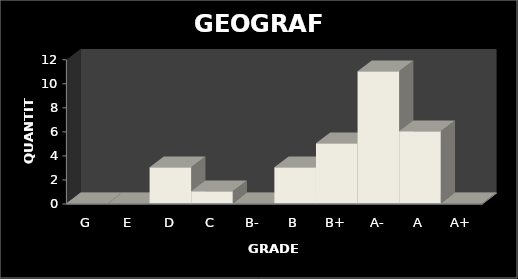
| Category | QUANTITY |
|---|---|
| G | 0 |
| E | 0 |
| D | 3 |
| C | 1 |
| B- | 0 |
| B | 3 |
| B+ | 5 |
| A- | 11 |
| A | 6 |
| A+ | 0 |